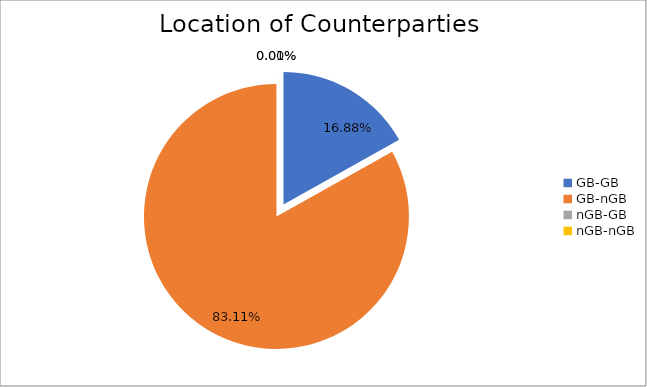
| Category | Series 0 |
|---|---|
| GB-GB | 1533371.231 |
| GB-nGB | 7550826.09 |
| nGB-GB | 0 |
| nGB-nGB | 797.223 |